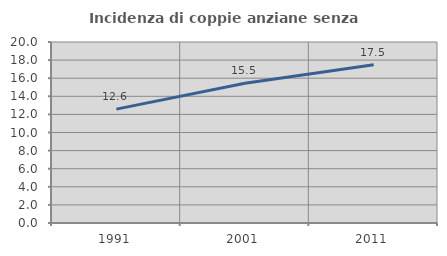
| Category | Incidenza di coppie anziane senza figli  |
|---|---|
| 1991.0 | 12.583 |
| 2001.0 | 15.452 |
| 2011.0 | 17.498 |